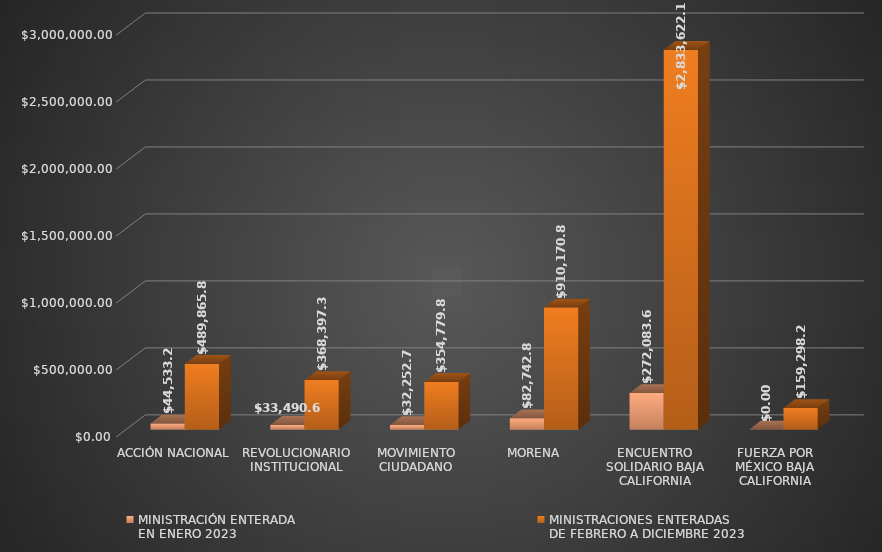
| Category | MINISTRACIÓN ENTERADA
EN ENERO 2023 | MINISTRACIONES ENTERADAS 
DE FEBRERO A DICIEMBRE 2023 |
|---|---|---|
| ACCIÓN NACIONAL | 44533.26 | 489865.88 |
| REVOLUCIONARIO INSTITUCIONAL | 33490.67 | 368397.39 |
| MOVIMIENTO CIUDADANO | 32252.72 | 354779.89 |
| MORENA | 82742.8 | 910170.82 |
| ENCUENTRO SOLIDARIO BAJA CALIFORNIA | 272083.67 | 2833622.12 |
| FUERZA POR MÉXICO BAJA CALIFORNIA | 0 | 159298.26 |